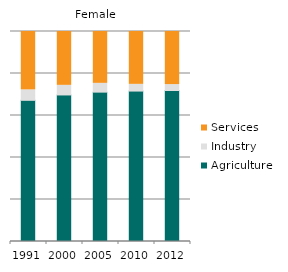
| Category | Agriculture | Industry | Services |
|---|---|---|---|
| 1991.0 | 67.232 | 4.976 | 27.791 |
| 2000.0 | 69.784 | 4.575 | 25.641 |
| 2005.0 | 71.128 | 4.183 | 24.689 |
| 2010.0 | 71.636 | 3.193 | 25.171 |
| 2012.0 | 71.897 | 2.82 | 25.283 |